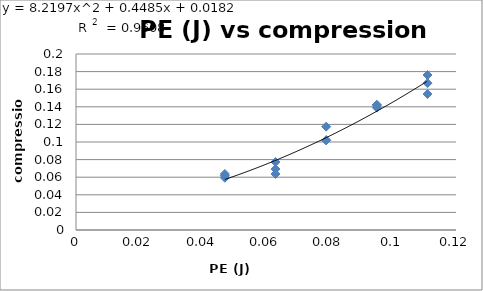
| Category | Series 0 |
|---|---|
| 0.111 | 0.155 |
| 0.111 | 0.176 |
| 0.111 | 0.167 |
| 0.095 | 0.139 |
| 0.095 | 0.142 |
| 0.095 | 0.142 |
| 0.079 | 0.117 |
| 0.079 | 0.102 |
| 0.079 | 0.102 |
| 0.063 | 0.069 |
| 0.063 | 0.077 |
| 0.063 | 0.064 |
| 0.047 | 0.064 |
| 0.047 | 0.059 |
| 0.047 | 0.062 |